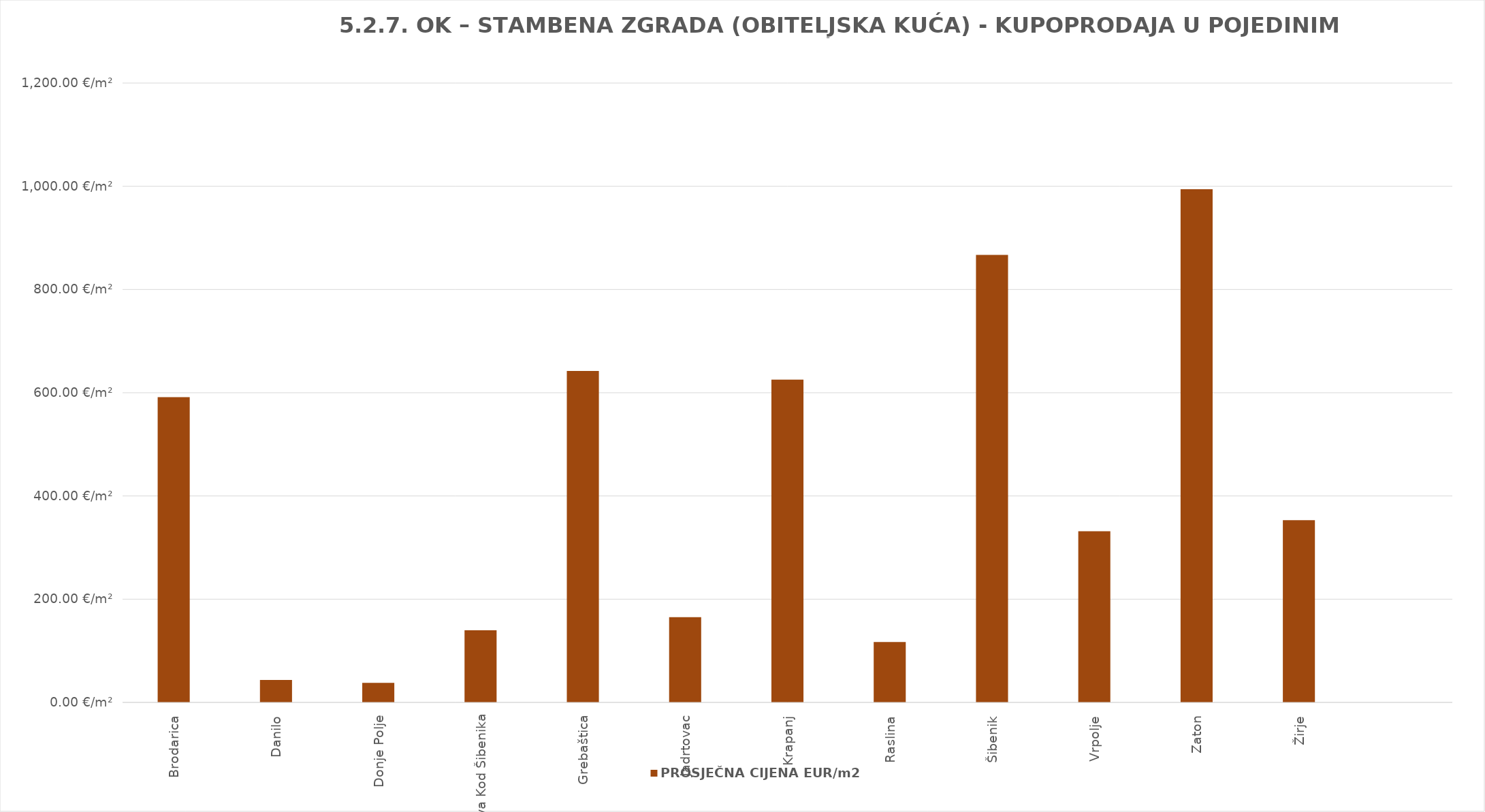
| Category | PROSJEČNA CIJENA EUR/m2 |
|---|---|
| Brodarica | 1901-08-13 09:19:32 |
| Danilo | 1900-02-12 08:42:40 |
| Donje Polje | 1900-02-06 23:55:18 |
| Dubrava Kod Šibenika | 1900-05-18 16:49:19 |
| Grebaštica | 1901-10-03 02:38:08 |
| Jadrtovac | 1900-06-13 04:39:12 |
| Krapanj | 1901-09-16 10:20:31 |
| Raslina | 1900-04-26 02:50:25 |
| Šibenik | 1902-05-15 22:12:46 |
| Vrpolje | 1900-11-26 15:08:06 |
| Zaton | 1902-09-20 05:17:26 |
| Žirje | 1900-12-18 00:50:21 |